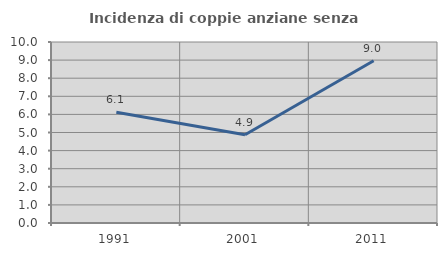
| Category | Incidenza di coppie anziane senza figli  |
|---|---|
| 1991.0 | 6.115 |
| 2001.0 | 4.878 |
| 2011.0 | 8.967 |